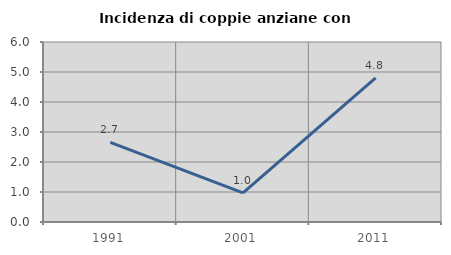
| Category | Incidenza di coppie anziane con figli |
|---|---|
| 1991.0 | 2.655 |
| 2001.0 | 0.971 |
| 2011.0 | 4.808 |